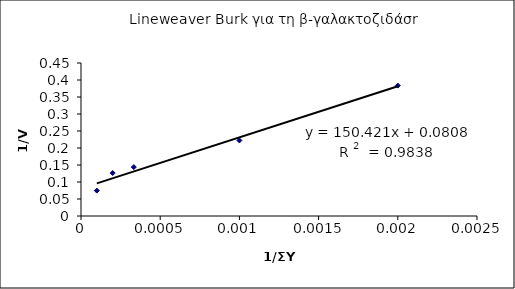
| Category | 1/V |
|---|---|
| 0.002 | 0.384 |
| 0.001 | 0.222 |
| 0.0003333333333333333 | 0.144 |
| 0.0002 | 0.126 |
| 0.0001 | 0.075 |